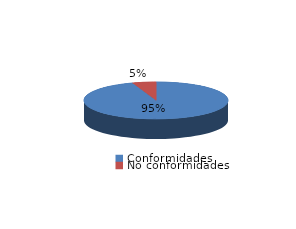
| Category | Series 0 |
|---|---|
| Conformidades | 874 |
| No conformidades | 49 |